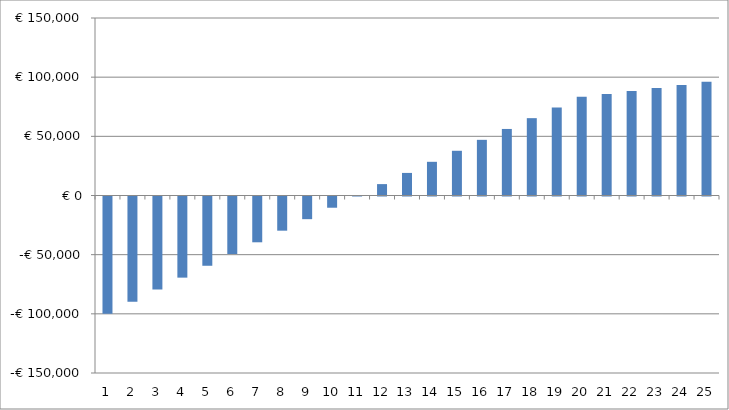
| Category | Series 0 |
|---|---|
| 0 | -99127.8 |
| 1 | -88862.44 |
| 2 | -78675.886 |
| 3 | -68567.107 |
| 4 | -58535.074 |
| 5 | -48578.762 |
| 6 | -38697.149 |
| 7 | -28889.213 |
| 8 | -19153.935 |
| 9 | -9490.301 |
| 10 | 102.706 |
| 11 | 9626.097 |
| 12 | 19080.884 |
| 13 | 28468.076 |
| 14 | 37788.682 |
| 15 | 47043.71 |
| 16 | 56234.166 |
| 17 | 65361.056 |
| 18 | 74425.384 |
| 19 | 83428.156 |
| 20 | 85851.858 |
| 21 | 88329.609 |
| 22 | 90862.491 |
| 23 | 93451.607 |
| 24 | 96098.082 |